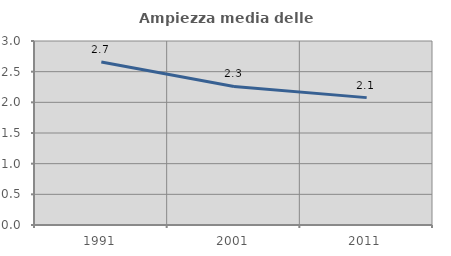
| Category | Ampiezza media delle famiglie |
|---|---|
| 1991.0 | 2.656 |
| 2001.0 | 2.26 |
| 2011.0 | 2.077 |